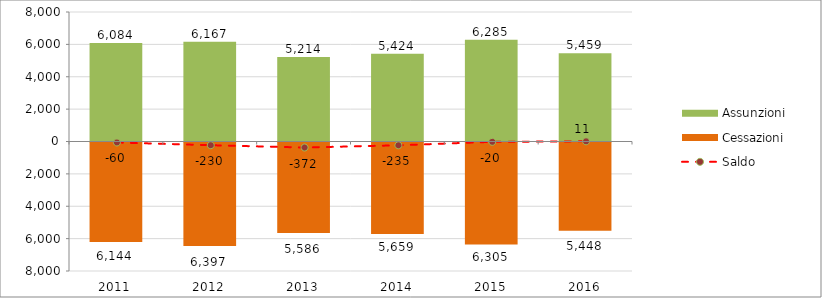
| Category | Assunzioni | Cessazioni |
|---|---|---|
| 2011.0 | 6084 | -6144 |
| 2012.0 | 6167 | -6397 |
| 2013.0 | 5214 | -5586 |
| 2014.0 | 5424 | -5659 |
| 2015.0 | 6285 | -6305 |
| 2016.0 | 5459 | -5448 |